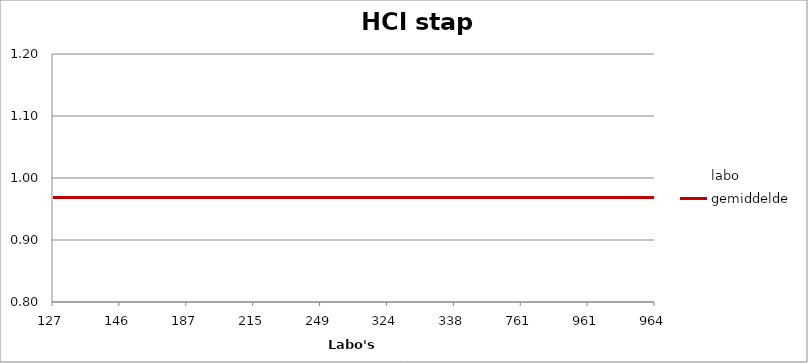
| Category | labo | gemiddelde |
|---|---|---|
| 127.0 | 0.998 | 0.969 |
| 146.0 | 1.038 | 0.969 |
| 187.0 | 0.977 | 0.969 |
| 215.0 | 0.972 | 0.969 |
| 249.0 | 0.902 | 0.969 |
| 324.0 | 0.952 | 0.969 |
| 338.0 | 0.977 | 0.969 |
| 761.0 | 0.902 | 0.969 |
| 961.0 | 1.125 | 0.969 |
| 964.0 | 1.028 | 0.969 |